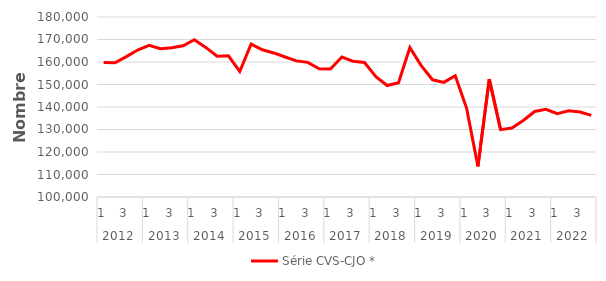
| Category | Série CVS-CJO * |
|---|---|
| 0 | 159737.205 |
| 1 | 159688.398 |
| 2 | 162371.772 |
| 3 | 165303.481 |
| 4 | 167362.236 |
| 5 | 165880.788 |
| 6 | 166324.176 |
| 7 | 167204.404 |
| 8 | 169886.639 |
| 9 | 166488.506 |
| 10 | 162569.107 |
| 11 | 162727.766 |
| 12 | 155782.096 |
| 13 | 167936.183 |
| 14 | 165452.897 |
| 15 | 164018.662 |
| 16 | 162233.153 |
| 17 | 160498.057 |
| 18 | 159842.25 |
| 19 | 157026.906 |
| 20 | 156862.117 |
| 21 | 162198.317 |
| 22 | 160289.888 |
| 23 | 159798.524 |
| 24 | 153487.511 |
| 25 | 149535.42 |
| 26 | 150743.836 |
| 27 | 166393.431 |
| 28 | 158386.498 |
| 29 | 152092.37 |
| 30 | 150958.771 |
| 31 | 153941.354 |
| 32 | 139501.035 |
| 33 | 113601.801 |
| 34 | 152404.444 |
| 35 | 129924.019 |
| 36 | 130678.944 |
| 37 | 134020.402 |
| 38 | 138004.446 |
| 39 | 138998.324 |
| 40 | 137044.3 |
| 41 | 138311.163 |
| 42 | 137753.968 |
| 43 | 136275.805 |